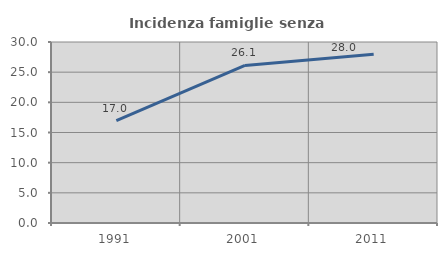
| Category | Incidenza famiglie senza nuclei |
|---|---|
| 1991.0 | 16.975 |
| 2001.0 | 26.113 |
| 2011.0 | 27.968 |